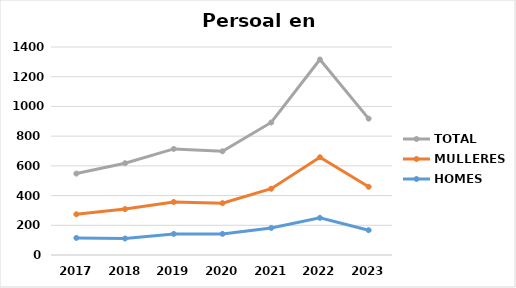
| Category | HOMES | MULLERES | TOTAL |
|---|---|---|---|
| 2017.0 | 115 | 159 | 274 |
| 2018.0 | 111 | 198 | 309 |
| 2019.0 | 142 | 215 | 357 |
| 2020.0 | 142 | 207 | 349 |
| 2021.0 | 182 | 264 | 446 |
| 2022.0 | 250 | 408 | 658 |
| 2023.0 | 167 | 292 | 459 |